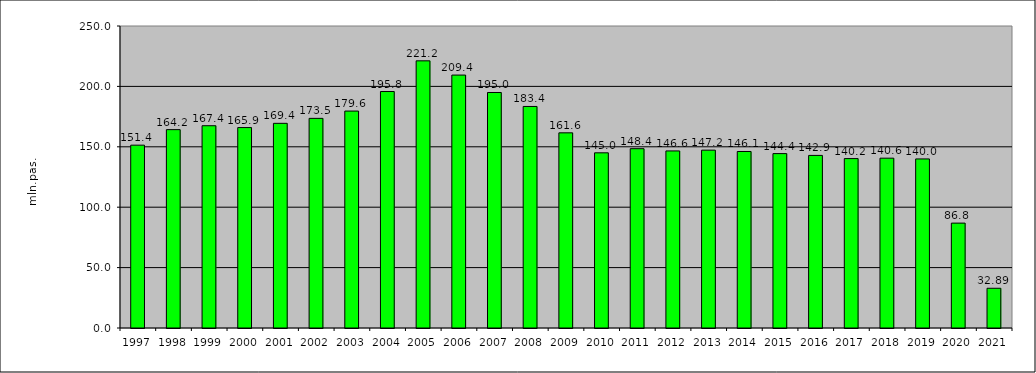
| Category | passengers transported (mill pas.) |
|---|---|
| 1997.0 | 151.353 |
| 1998.0 | 164.213 |
| 1999.0 | 167.439 |
| 2000.0 | 165.917 |
| 2001.0 | 169.429 |
| 2002.0 | 173.532 |
| 2003.0 | 179.572 |
| 2004.0 | 195.756 |
| 2005.0 | 221.168 |
| 2006.0 | 209.381 |
| 2007.0 | 194.955 |
| 2008.0 | 183.39 |
| 2009.0 | 161.559 |
| 2010.0 | 145.021 |
| 2011.0 | 148.448 |
| 2012.0 | 146.587 |
| 2013.0 | 147.216 |
| 2014.0 | 146.114 |
| 2015.0 | 144.374 |
| 2016.0 | 142.871 |
| 2017.0 | 140.249 |
| 2018.0 | 140.583 |
| 2019.0 | 139.955 |
| 2020.0 | 86.825 |
| 2021.0 | 32.891 |